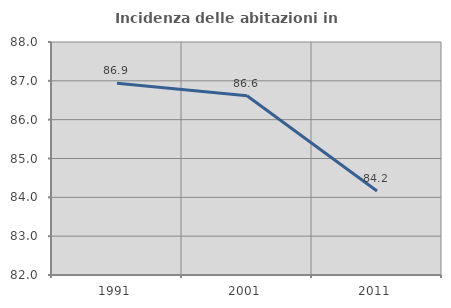
| Category | Incidenza delle abitazioni in proprietà  |
|---|---|
| 1991.0 | 86.936 |
| 2001.0 | 86.617 |
| 2011.0 | 84.163 |